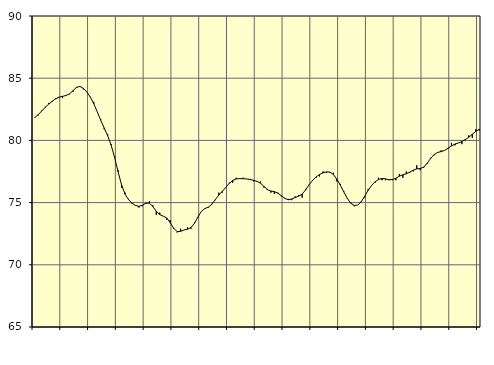
| Category | Piggar | Series 1 |
|---|---|---|
| nan | 81.8 | 81.83 |
| 87.0 | 82 | 82.07 |
| 87.0 | 82.4 | 82.36 |
| 87.0 | 82.7 | 82.65 |
| nan | 83 | 82.91 |
| 88.0 | 83.1 | 83.14 |
| 88.0 | 83.4 | 83.34 |
| 88.0 | 83.5 | 83.47 |
| nan | 83.4 | 83.54 |
| 89.0 | 83.6 | 83.61 |
| 89.0 | 83.7 | 83.74 |
| 89.0 | 83.9 | 83.99 |
| nan | 84.3 | 84.25 |
| 90.0 | 84.3 | 84.34 |
| 90.0 | 84.1 | 84.19 |
| 90.0 | 83.9 | 83.89 |
| nan | 83.5 | 83.49 |
| 91.0 | 83.1 | 82.95 |
| 91.0 | 82.3 | 82.3 |
| 91.0 | 81.7 | 81.62 |
| nan | 80.9 | 81 |
| 92.0 | 80.5 | 80.38 |
| 92.0 | 79.7 | 79.62 |
| 92.0 | 78.7 | 78.63 |
| nan | 77.6 | 77.48 |
| 93.0 | 76.2 | 76.43 |
| 93.0 | 75.8 | 75.68 |
| 93.0 | 75.3 | 75.24 |
| nan | 74.9 | 74.96 |
| 94.0 | 74.8 | 74.77 |
| 94.0 | 74.6 | 74.7 |
| 94.0 | 74.7 | 74.79 |
| nan | 74.9 | 74.95 |
| 95.0 | 75.1 | 74.96 |
| 95.0 | 74.8 | 74.69 |
| 95.0 | 74 | 74.3 |
| nan | 74.2 | 74.03 |
| 96.0 | 73.9 | 73.91 |
| 96.0 | 73.6 | 73.76 |
| 96.0 | 73.6 | 73.39 |
| nan | 72.9 | 72.95 |
| 97.0 | 72.6 | 72.67 |
| 97.0 | 72.9 | 72.69 |
| 97.0 | 72.8 | 72.8 |
| nan | 73 | 72.86 |
| 98.0 | 72.9 | 73 |
| 98.0 | 73.4 | 73.34 |
| 98.0 | 73.8 | 73.84 |
| nan | 74.3 | 74.3 |
| 99.0 | 74.5 | 74.52 |
| 99.0 | 74.6 | 74.64 |
| 99.0 | 74.9 | 74.87 |
| nan | 75.2 | 75.24 |
| 0.0 | 75.8 | 75.6 |
| 0.0 | 75.8 | 75.9 |
| 0.0 | 76.2 | 76.22 |
| nan | 76.6 | 76.54 |
| 1.0 | 76.6 | 76.78 |
| 1.0 | 77 | 76.9 |
| 1.0 | 76.9 | 76.93 |
| nan | 77 | 76.92 |
| 2.0 | 76.9 | 76.9 |
| 2.0 | 76.9 | 76.86 |
| 2.0 | 76.7 | 76.79 |
| nan | 76.7 | 76.71 |
| 3.0 | 76.7 | 76.56 |
| 3.0 | 76.2 | 76.3 |
| 3.0 | 76.1 | 76.04 |
| nan | 75.8 | 75.93 |
| 4.0 | 75.7 | 75.88 |
| 4.0 | 75.8 | 75.76 |
| 4.0 | 75.5 | 75.56 |
| nan | 75.3 | 75.34 |
| 5.0 | 75.3 | 75.23 |
| 5.0 | 75.2 | 75.29 |
| 5.0 | 75.5 | 75.41 |
| nan | 75.6 | 75.52 |
| 6.0 | 75.4 | 75.69 |
| 6.0 | 76.1 | 76.02 |
| 6.0 | 76.4 | 76.43 |
| nan | 76.8 | 76.78 |
| 7.0 | 77 | 77.06 |
| 7.0 | 77.1 | 77.26 |
| 7.0 | 77.5 | 77.39 |
| nan | 77.4 | 77.47 |
| 8.0 | 77.4 | 77.45 |
| 8.0 | 77.4 | 77.26 |
| 8.0 | 76.7 | 76.88 |
| nan | 76.5 | 76.4 |
| 9.0 | 75.9 | 75.85 |
| 9.0 | 75.3 | 75.34 |
| 9.0 | 75 | 74.95 |
| nan | 74.7 | 74.77 |
| 10.0 | 74.8 | 74.8 |
| 10.0 | 75.1 | 75.06 |
| 10.0 | 75.4 | 75.51 |
| nan | 76.1 | 75.98 |
| 11.0 | 76.4 | 76.38 |
| 11.0 | 76.6 | 76.67 |
| 11.0 | 77 | 76.86 |
| nan | 76.8 | 76.94 |
| 12.0 | 76.8 | 76.91 |
| 12.0 | 76.8 | 76.84 |
| 12.0 | 76.8 | 76.85 |
| nan | 76.8 | 76.96 |
| 13.0 | 77.3 | 77.12 |
| 13.0 | 77 | 77.24 |
| 13.0 | 77.5 | 77.32 |
| nan | 77.4 | 77.45 |
| 14.0 | 77.5 | 77.61 |
| 14.0 | 78 | 77.71 |
| 14.0 | 77.6 | 77.74 |
| nan | 77.8 | 77.85 |
| 15.0 | 78.1 | 78.16 |
| 15.0 | 78.6 | 78.55 |
| 15.0 | 78.8 | 78.86 |
| nan | 79 | 79.03 |
| 16.0 | 79.2 | 79.1 |
| 16.0 | 79.2 | 79.19 |
| 16.0 | 79.4 | 79.36 |
| nan | 79.8 | 79.56 |
| 17.0 | 79.6 | 79.71 |
| 17.0 | 79.8 | 79.79 |
| 17.0 | 79.7 | 79.91 |
| nan | 80 | 80.07 |
| 18.0 | 80.4 | 80.26 |
| 18.0 | 80.2 | 80.5 |
| 18.0 | 80.9 | 80.72 |
| nan | 80.8 | 80.9 |